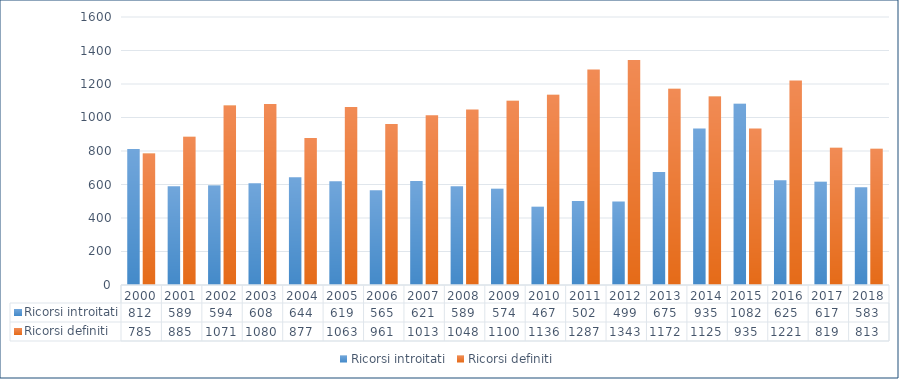
| Category | Ricorsi introitati | Ricorsi definiti |
|---|---|---|
| 2000.0 | 812 | 785 |
| 2001.0 | 589 | 885 |
| 2002.0 | 594 | 1071 |
| 2003.0 | 608 | 1080 |
| 2004.0 | 644 | 877 |
| 2005.0 | 619 | 1063 |
| 2006.0 | 565 | 961 |
| 2007.0 | 621 | 1013 |
| 2008.0 | 589 | 1048 |
| 2009.0 | 574 | 1100 |
| 2010.0 | 467 | 1136 |
| 2011.0 | 502 | 1287 |
| 2012.0 | 499 | 1343 |
| 2013.0 | 675 | 1172 |
| 2014.0 | 935 | 1125 |
| 2015.0 | 1082 | 935 |
| 2016.0 | 625 | 1221 |
| 2017.0 | 617 | 819 |
| 2018.0 | 583 | 813 |